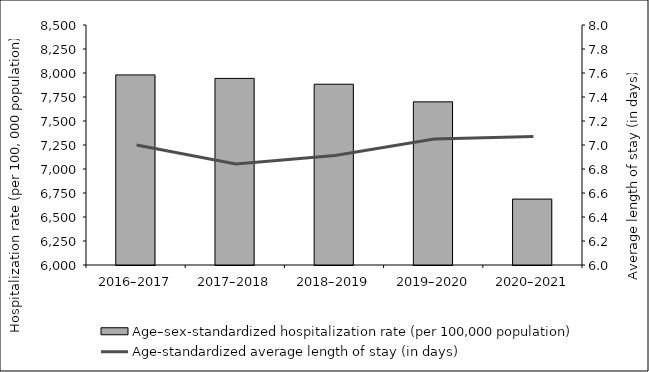
| Category | Age–sex-standardized hospitalization rate (per 100,000 population) |
|---|---|
| 2016–2017 | 7980 |
| 2017–2018 | 7943.875 |
| 2018–2019 | 7883.11 |
| 2019–2020 | 7699.481 |
| 2020–2021 | 6686.675 |